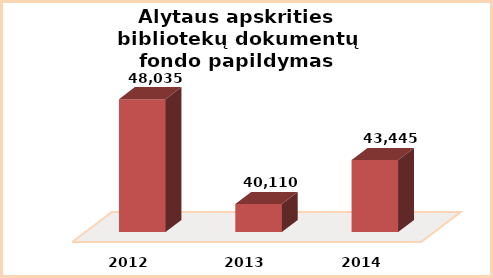
| Category | Series 0 |
|---|---|
| 2012.0 | 48035 |
| 2013.0 | 40110 |
| 2014.0 | 43445 |